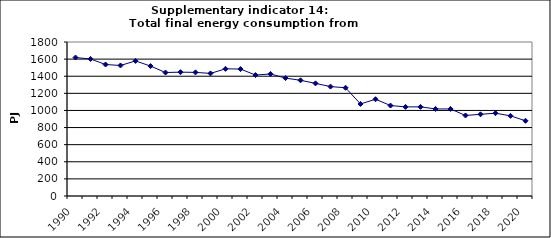
| Category | Total final energy consumption from industry, PJ |
|---|---|
| 1990 | 1618.6 |
| 1991 | 1601.732 |
| 1992 | 1536.999 |
| 1993 | 1525.662 |
| 1994 | 1578.897 |
| 1995 | 1518.823 |
| 1996 | 1443.198 |
| 1997 | 1447.69 |
| 1998 | 1444.955 |
| 1999 | 1432.801 |
| 2000 | 1486.572 |
| 2001 | 1483.912 |
| 2002 | 1413.626 |
| 2003 | 1426.618 |
| 2004 | 1377.978 |
| 2005 | 1352.47 |
| 2006 | 1316.422 |
| 2007 | 1278.661 |
| 2008 | 1265.232 |
| 2009 | 1075.465 |
| 2010 | 1130.888 |
| 2011 | 1057.345 |
| 2012 | 1041.491 |
| 2013 | 1042.013 |
| 2014 | 1017.435 |
| 2015 | 1017.504 |
| 2016 | 941.219 |
| 2017 | 954.881 |
| 2018 | 967.924 |
| 2019 | 936.915 |
| 2020 | 879.281 |